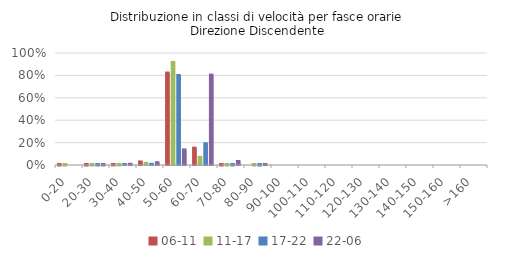
| Category | 06-11 | 11-17 | 17-22 | 22-06 |
|---|---|---|---|---|
| 0-20 | 0 | 0 | 0 | 0 |
| 20-30 | 0 | 0 | 0 | 0.001 |
| 30-40 | 0.001 | 0.001 | 0.004 | 0.007 |
| 40-50 | 0.027 | 0.014 | 0.006 | 0.021 |
| 50-60 | 0.821 | 0.916 | 0.799 | 0.135 |
| 60-70 | 0.15 | 0.069 | 0.189 | 0.803 |
| 70-80 | 0 | 0 | 0 | 0.032 |
| 80-90 | 0 | 0 | 0 | 0.004 |
| 90-100 | 0 | 0 | 0 | 0 |
| 100-110 | 0 | 0 | 0 | 0 |
| 110-120 | 0 | 0 | 0 | 0 |
| 120-130 | 0 | 0 | 0 | 0 |
| 130-140 | 0 | 0 | 0 | 0 |
| 140-150 | 0 | 0 | 0 | 0 |
| 150-160 | 0 | 0 | 0 | 0 |
| >160 | 0 | 0 | 0 | 0 |